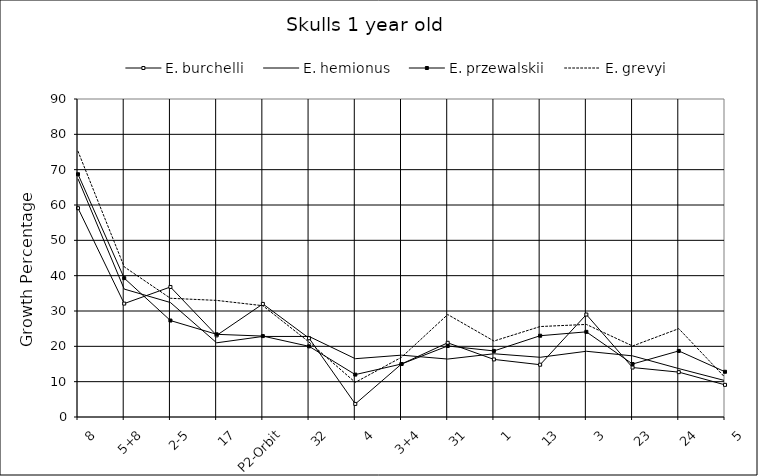
| Category | E. burchelli | E. hemionus | E. przewalskii | E. grevyi |
|---|---|---|---|---|
| 8 | 59.1 | 67.4 | 68.7 | 75.2 |
| 5+8 | 32.1 | 36.2 | 39.3 | 42.5 |
| 2-5 | 36.8 | 32.4 | 27.3 | 33.6 |
| 17 | 23.1 | 21 | 23.4 | 33 |
| P2-Orbit | 32 | 22.8 | 22.9 | 31.5 |
| 32 | 22.3 | 22.8 | 20 | 21.2 |
| 4 | 3.7 | 16.5 | 12 | 9.8 |
| 3+4 | 15 | 17.5 | 15 | 16.9 |
| 31 | 21 | 16.4 | 20.1 | 29 |
| 1 | 16.3 | 17.9 | 18.7 | 21.5 |
| 13 | 14.8 | 16.9 | 23 | 25.6 |
| 3 | 29 | 18.6 | 24.1 | 26.2 |
| 23 | 14 | 17.3 | 15 | 20.1 |
| 24 | 12.7 | 13.7 | 18.7 | 25 |
| 5 | 9.1 | 10.3 | 12.8 | 11.2 |